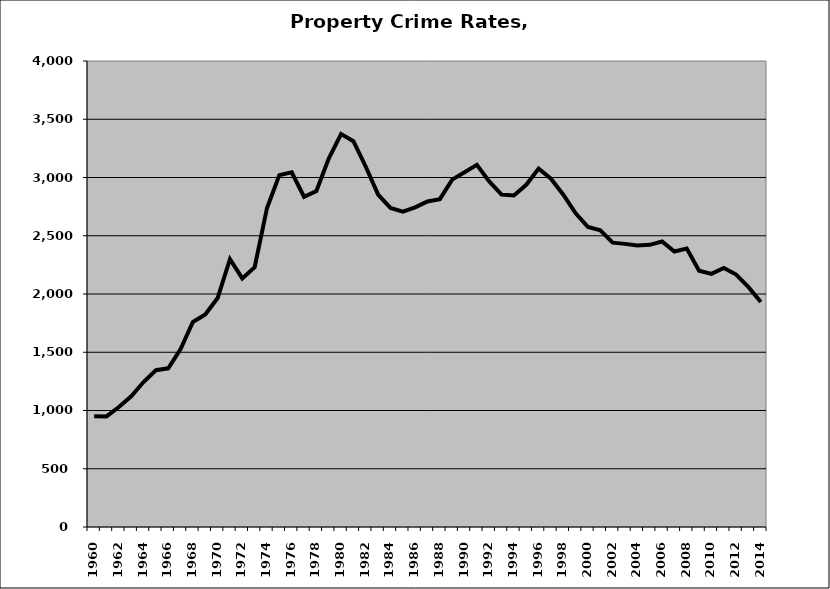
| Category | Property |
|---|---|
| 1960.0 | 950.46 |
| 1961.0 | 949.555 |
| 1962.0 | 1029.949 |
| 1963.0 | 1122.278 |
| 1964.0 | 1244.576 |
| 1965.0 | 1345.92 |
| 1966.0 | 1362.243 |
| 1967.0 | 1527.87 |
| 1968.0 | 1760.169 |
| 1969.0 | 1823.909 |
| 1970.0 | 1965.633 |
| 1971.0 | 2299.461 |
| 1972.0 | 2133.641 |
| 1973.0 | 2229.55 |
| 1974.0 | 2738.521 |
| 1975.0 | 3020.259 |
| 1976.0 | 3045.009 |
| 1977.0 | 2834.697 |
| 1978.0 | 2883.609 |
| 1979.0 | 3161.828 |
| 1980.0 | 3372.408 |
| 1981.0 | 3311.463 |
| 1982.0 | 3092.314 |
| 1983.0 | 2852.636 |
| 1984.0 | 2738.93 |
| 1985.0 | 2706.387 |
| 1986.0 | 2743.284 |
| 1987.0 | 2793.867 |
| 1988.0 | 2814.384 |
| 1989.0 | 2981.794 |
| 1990.0 | 3045.076 |
| 1991.0 | 3108.553 |
| 1992.0 | 2965.734 |
| 1993.0 | 2853.926 |
| 1994.0 | 2845.179 |
| 1995.0 | 2937.566 |
| 1996.0 | 3076.07 |
| 1997.0 | 2989.376 |
| 1998.0 | 2852.412 |
| 1999.0 | 2693.185 |
| 2000.0 | 2575.3 |
| 2001.0 | 2547.39 |
| 2002.0 | 2440.362 |
| 2003.0 | 2430.239 |
| 2004.0 | 2417.296 |
| 2005.0 | 2421.891 |
| 2006.0 | 2450.955 |
| 2007.0 | 2364.352 |
| 2008.0 | 2389.736 |
| 2009.0 | 2199.025 |
| 2010.0 | 2173.002 |
| 2011.0 | 2224.13 |
| 2012.0 | 2166.654 |
| 2013.0 | 2059.071 |
| 2014.0 | 1931.743 |